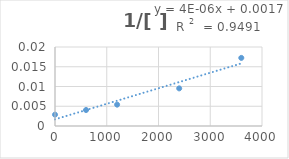
| Category | Series 0 |
|---|---|
| 0.0 | 0.003 |
| 600.0 | 0.004 |
| 1200.0 | 0.005 |
| 2400.0 | 0.01 |
| 3600.0 | 0.017 |